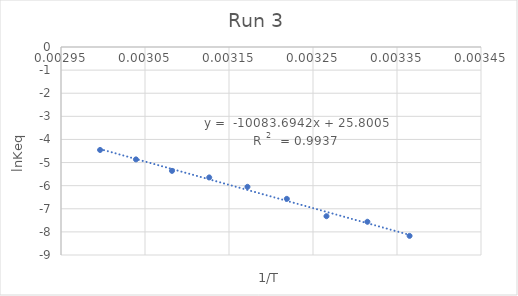
| Category | SIPr repeat-2 |
|---|---|
| 0.003364963994885255 | -8.173 |
| 0.003314770617873243 | -7.562 |
| 0.0032660526487686982 | -7.321 |
| 0.0032188495831589788 | -6.57 |
| 0.003171985028230667 | -6.05 |
| 0.0031264655307175235 | -5.643 |
| 0.0030821390044691015 | -5.36 |
| 0.0030392365437802026 | -4.863 |
| 0.002996524032122737 | -4.455 |